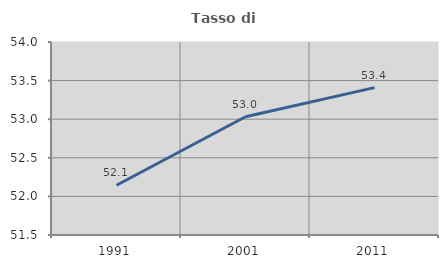
| Category | Tasso di occupazione   |
|---|---|
| 1991.0 | 52.145 |
| 2001.0 | 53.032 |
| 2011.0 | 53.409 |